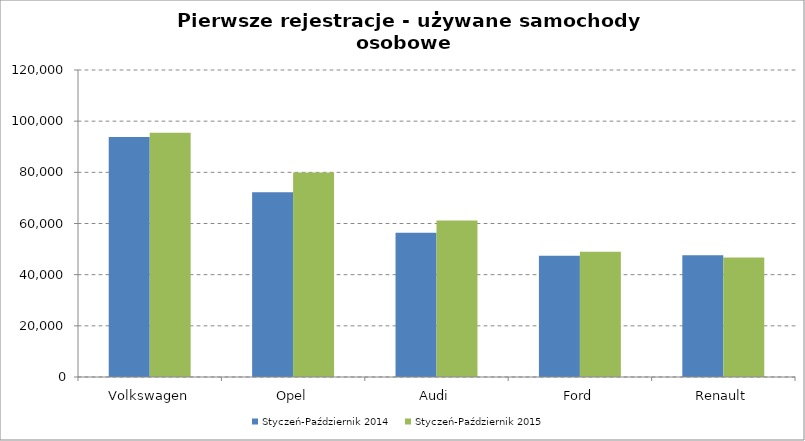
| Category | Styczeń-Październik 2014 | Styczeń-Październik 2015 |
|---|---|---|
| Volkswagen | 93853 | 95463 |
| Opel | 72179 | 79918 |
| Audi | 56404 | 61209 |
| Ford | 47401 | 48914 |
| Renault | 47543 | 46738 |